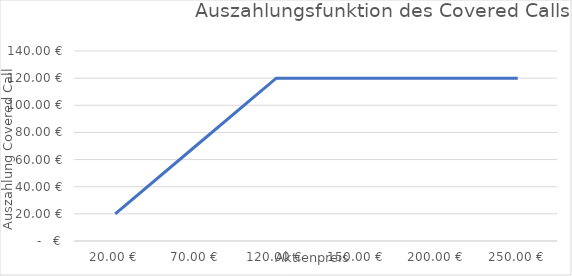
| Category | Covered Call |
|---|---|
| 20.0 | 20 |
| 70.0 | 70 |
| 120.0 | 120 |
| 150.0 | 120 |
| 200.0 | 120 |
| 250.0 | 120 |